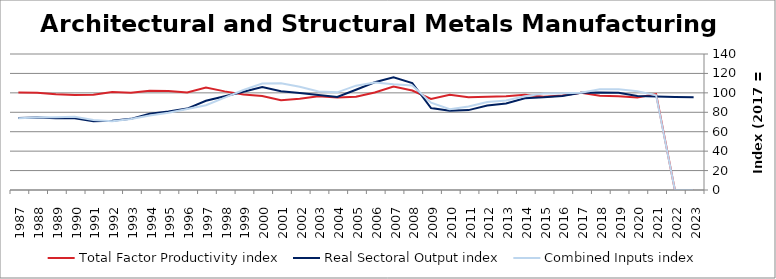
| Category | Total Factor Productivity index | Real Sectoral Output index | Combined Inputs index |
|---|---|---|---|
| 2023.0 | 0 | 95.546 | 0 |
| 2022.0 | 0 | 95.854 | 0 |
| 2021.0 | 98.759 | 96.226 | 97.435 |
| 2020.0 | 95.271 | 96.757 | 101.559 |
| 2019.0 | 96.561 | 100.202 | 103.771 |
| 2018.0 | 96.959 | 100.491 | 103.642 |
| 2017.0 | 100 | 100 | 100 |
| 2016.0 | 97.19 | 96.758 | 99.556 |
| 2015.0 | 96.119 | 95.376 | 99.227 |
| 2014.0 | 98.022 | 94.53 | 96.438 |
| 2013.0 | 96.616 | 89.095 | 92.216 |
| 2012.0 | 96.008 | 86.874 | 90.487 |
| 2011.0 | 95.563 | 82.234 | 86.053 |
| 2010.0 | 98.003 | 81.523 | 83.184 |
| 2009.0 | 93.828 | 84.354 | 89.903 |
| 2008.0 | 102.43 | 110.146 | 107.534 |
| 2007.0 | 106.55 | 115.921 | 108.795 |
| 2006.0 | 100.304 | 110.923 | 110.587 |
| 2005.0 | 96.078 | 103.18 | 107.392 |
| 2004.0 | 95.279 | 95.768 | 100.513 |
| 2003.0 | 96.59 | 97.85 | 101.305 |
| 2002.0 | 93.818 | 99.775 | 106.35 |
| 2001.0 | 92.419 | 101.563 | 109.894 |
| 2000.0 | 96.7 | 105.899 | 109.513 |
| 1999.0 | 98.228 | 101.076 | 102.9 |
| 1998.0 | 101.512 | 96.486 | 95.049 |
| 1997.0 | 105.374 | 91.893 | 87.207 |
| 1996.0 | 100.393 | 83.785 | 83.458 |
| 1995.0 | 101.8 | 80.86 | 79.43 |
| 1994.0 | 102.288 | 78.421 | 76.667 |
| 1993.0 | 100.201 | 73.242 | 73.095 |
| 1992.0 | 100.875 | 71.331 | 70.712 |
| 1991.0 | 98.045 | 70.742 | 72.152 |
| 1990.0 | 97.764 | 73.777 | 75.464 |
| 1989.0 | 98.443 | 73.801 | 74.969 |
| 1988.0 | 100.127 | 74.697 | 74.602 |
| 1987.0 | 100.478 | 74.161 | 73.808 |